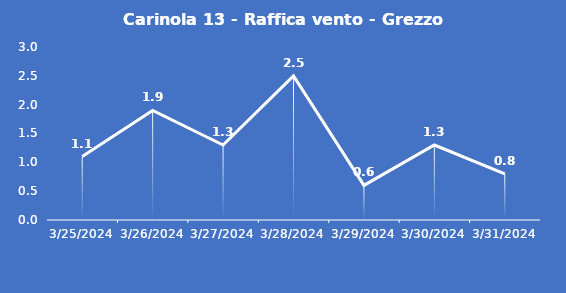
| Category | Carinola 13 - Raffica vento - Grezzo (m/s) |
|---|---|
| 3/25/24 | 1.1 |
| 3/26/24 | 1.9 |
| 3/27/24 | 1.3 |
| 3/28/24 | 2.5 |
| 3/29/24 | 0.6 |
| 3/30/24 | 1.3 |
| 3/31/24 | 0.8 |